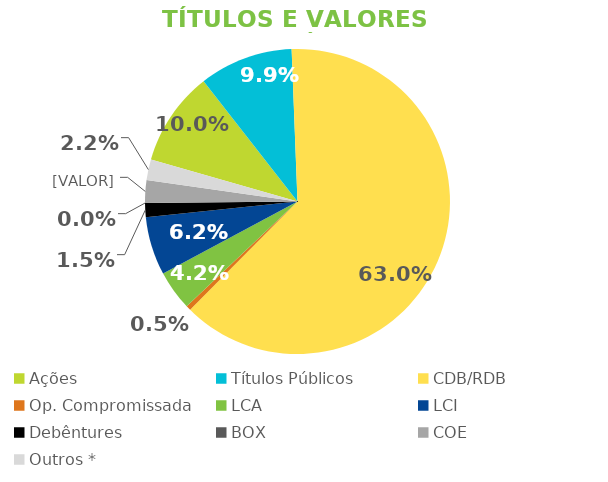
| Category | TVM |
|---|---|
| Ações | 0.1 |
| Títulos Públicos | 0.099 |
| CDB/RDB | 0.63 |
| Op. Compromissada | 0.005 |
| LCA | 0.042 |
| LCI | 0.062 |
| Debêntures | 0.015 |
| BOX | 0 |
| COE | 0.024 |
| Outros * | 0.022 |